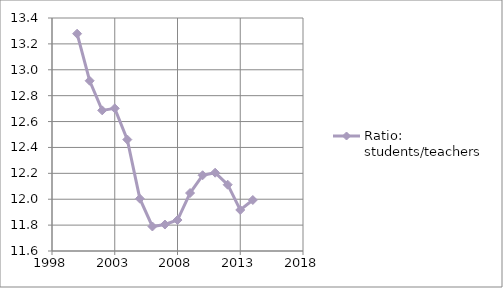
| Category | Ratio: students/teachers |
|---|---|
| 2000.0 | 13.279 |
| 2001.0 | 12.915 |
| 2002.0 | 12.687 |
| 2003.0 | 12.702 |
| 2004.0 | 12.461 |
| 2005.0 | 12.004 |
| 2006.0 | 11.789 |
| 2007.0 | 11.804 |
| 2008.0 | 11.839 |
| 2009.0 | 12.048 |
| 2010.0 | 12.185 |
| 2011.0 | 12.205 |
| 2012.0 | 12.112 |
| 2013.0 | 11.917 |
| 2014.0 | 11.994 |